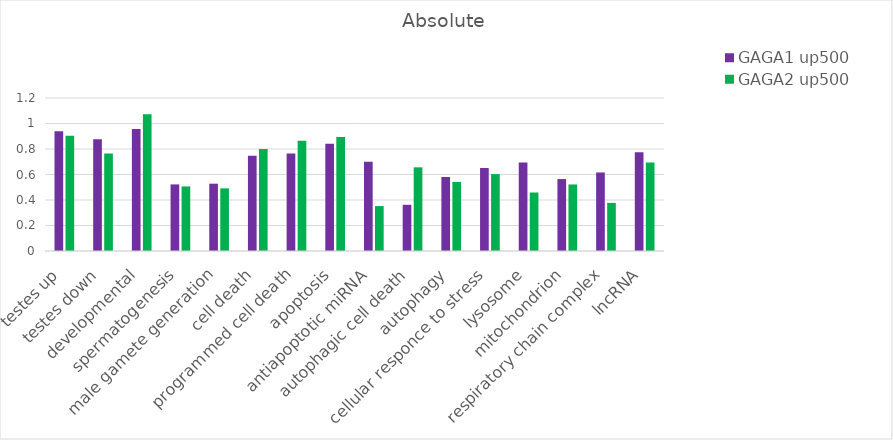
| Category | GAGA1 up500 | GAGA2 up500 |
|---|---|---|
| testes up | 0.94 | 0.904 |
| testes down | 0.877 | 0.764 |
| developmental | 0.957 | 1.072 |
| spermatogenesis | 0.522 | 0.506 |
| male gamete generation | 0.528 | 0.491 |
| cell death | 0.748 | 0.801 |
| programmed cell death | 0.764 | 0.865 |
| apoptosis | 0.842 | 0.895 |
| antiapoptotic miRNA | 0.7 | 0.352 |
| autophagic cell death | 0.362 | 0.656 |
| autophagy | 0.581 | 0.542 |
| cellular responce to stress | 0.651 | 0.603 |
| lysosome | 0.694 | 0.459 |
| mitochondrion | 0.564 | 0.522 |
| respiratory chain complex | 0.616 | 0.377 |
| lncRNA | 0.775 | 0.694 |